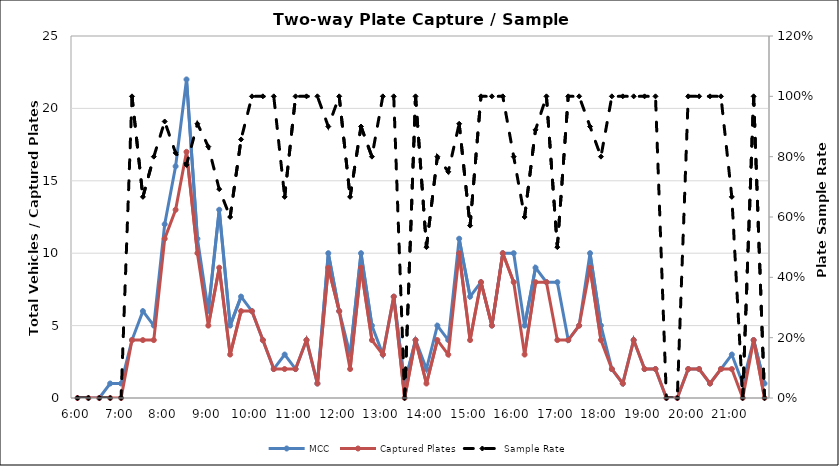
| Category | MCC | Captured Plates |
|---|---|---|
| 0.25 | 0 | 0 |
| 0.260416666666667 | 0 | 0 |
| 0.270833333333333 | 0 | 0 |
| 0.28125 | 1 | 0 |
| 0.291666666666667 | 1 | 0 |
| 0.302083333333333 | 4 | 4 |
| 0.3125 | 6 | 4 |
| 0.322916666666667 | 5 | 4 |
| 0.333333333333333 | 12 | 11 |
| 0.34375 | 16 | 13 |
| 0.354166666666667 | 22 | 17 |
| 0.364583333333333 | 11 | 10 |
| 0.375 | 6 | 5 |
| 0.385416666666667 | 13 | 9 |
| 0.395833333333333 | 5 | 3 |
| 0.40625 | 7 | 6 |
| 0.416666666666667 | 6 | 6 |
| 0.427083333333333 | 4 | 4 |
| 0.4375 | 2 | 2 |
| 0.447916666666667 | 3 | 2 |
| 0.458333333333333 | 2 | 2 |
| 0.46875 | 4 | 4 |
| 0.479166666666667 | 1 | 1 |
| 0.489583333333333 | 10 | 9 |
| 0.5 | 6 | 6 |
| 0.510416666666667 | 3 | 2 |
| 0.520833333333333 | 10 | 9 |
| 0.53125 | 5 | 4 |
| 0.541666666666667 | 3 | 3 |
| 0.552083333333333 | 7 | 7 |
| 0.5625 | 1 | 0 |
| 0.572916666666667 | 4 | 4 |
| 0.583333333333333 | 2 | 1 |
| 0.59375 | 5 | 4 |
| 0.604166666666667 | 4 | 3 |
| 0.614583333333333 | 11 | 10 |
| 0.625 | 7 | 4 |
| 0.635416666666667 | 8 | 8 |
| 0.645833333333333 | 5 | 5 |
| 0.65625 | 10 | 10 |
| 0.666666666666667 | 10 | 8 |
| 0.677083333333333 | 5 | 3 |
| 0.6875 | 9 | 8 |
| 0.697916666666667 | 8 | 8 |
| 0.708333333333333 | 8 | 4 |
| 0.71875 | 4 | 4 |
| 0.729166666666667 | 5 | 5 |
| 0.739583333333333 | 10 | 9 |
| 0.75 | 5 | 4 |
| 0.760416666666667 | 2 | 2 |
| 0.770833333333333 | 1 | 1 |
| 0.78125 | 4 | 4 |
| 0.791666666666667 | 2 | 2 |
| 0.802083333333333 | 2 | 2 |
| 0.8125 | 0 | 0 |
| 0.822916666666667 | 0 | 0 |
| 0.833333333333333 | 2 | 2 |
| 0.84375 | 2 | 2 |
| 0.854166666666667 | 1 | 1 |
| 0.864583333333333 | 2 | 2 |
| 0.875 | 3 | 2 |
| 0.885416666666667 | 1 | 0 |
| 0.895833333333333 | 4 | 4 |
| 0.90625 | 1 | 0 |